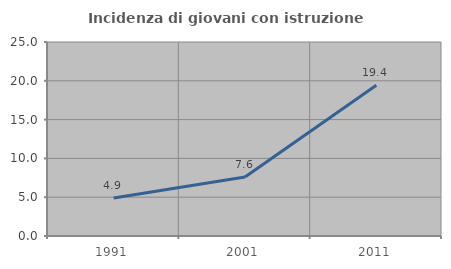
| Category | Incidenza di giovani con istruzione universitaria |
|---|---|
| 1991.0 | 4.894 |
| 2001.0 | 7.598 |
| 2011.0 | 19.419 |